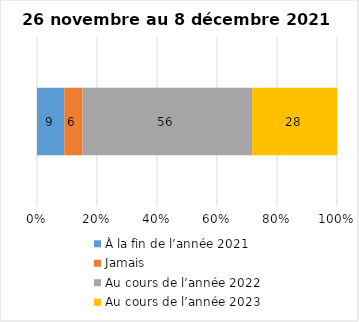
| Category | À la fin de l’année 2021 | Jamais | Au cours de l’année 2022 | Au cours de l’année 2023 |
|---|---|---|---|---|
| 0 | 9 | 6 | 56 | 28 |